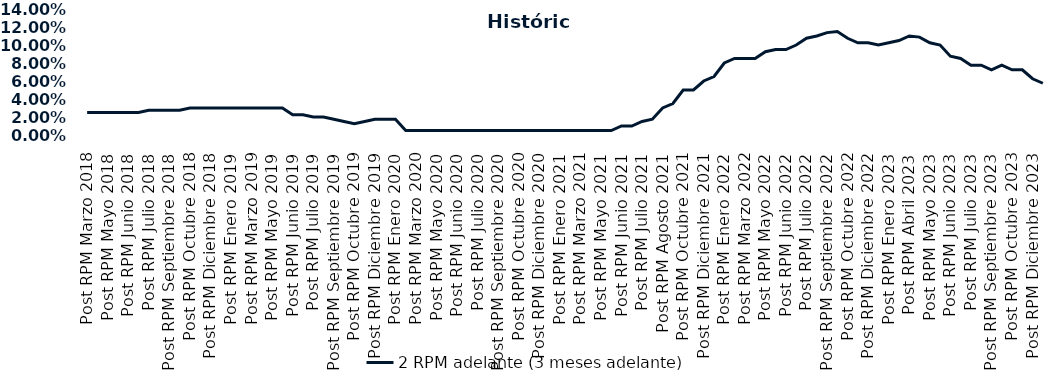
| Category | 2 RPM adelante (3 meses adelante) |
|---|---|
| Post RPM Marzo 2018 | 0.025 |
| Pre RPM Mayo 2018 | 0.025 |
| Post RPM Mayo 2018 | 0.025 |
| Pre RPM Junio 2018 | 0.025 |
| Post RPM Junio 2018 | 0.025 |
| Pre RPM Julio 2018 | 0.025 |
| Post RPM Julio 2018 | 0.028 |
| Pre RPM Septiembre 2018 | 0.028 |
| Post RPM Septiembre 2018 | 0.028 |
| Pre RPM Octubre 2018 | 0.028 |
| Post RPM Octubre 2018 | 0.03 |
| Pre RPM Diciembre 2018 | 0.03 |
| Post RPM Diciembre 2018 | 0.03 |
| Pre RPM Enero 2019 | 0.03 |
| Post RPM Enero 2019 | 0.03 |
| Pre RPM Marzo 2019 | 0.03 |
| Post RPM Marzo 2019 | 0.03 |
| Pre RPM Mayo 2019 | 0.03 |
| Post RPM Mayo 2019 | 0.03 |
| Pre RPM Junio 2019 | 0.03 |
| Post RPM Junio 2019 | 0.022 |
| Pre RPM Julio 2019 | 0.022 |
| Post RPM Julio 2019 | 0.02 |
| Pre RPM Septiembre 2019 | 0.02 |
| Post RPM Septiembre 2019 | 0.018 |
| Pre RPM Octubre 2019 | 0.015 |
| Post RPM Octubre 2019 | 0.012 |
| Pre RPM Diciembre 2019 | 0.015 |
| Post RPM Diciembre 2019 | 0.018 |
| Pre RPM Enero 2020 | 0.018 |
| Post RPM Enero 2020 | 0.018 |
| Pre RPM Marzo 2020 | 0.005 |
| Post RPM Marzo 2020 | 0.005 |
| Pre RPM Mayo 2020 | 0.005 |
| Post RPM Mayo 2020 | 0.005 |
| Pre RPM Junio 2020 | 0.005 |
| Post RPM Junio 2020 | 0.005 |
| Pre RPM Julio 2020 | 0.005 |
| Post RPM Julio 2020 | 0.005 |
| Pre RPM Septiembre 2020 | 0.005 |
| Post RPM Septiembre 2020 | 0.005 |
| Pre RPM Octubre 2020 | 0.005 |
| Post RPM Octubre 2020 | 0.005 |
| Pre RPM Diciembre 2020 | 0.005 |
| Post RPM Diciembre 2020 | 0.005 |
| Pre RPM Enero 2021 | 0.005 |
| Post RPM Enero 2021 | 0.005 |
| Pre RPM Marzo 2021 | 0.005 |
| Post RPM Marzo 2021 | 0.005 |
| Pre RPM Mayo 2021 | 0.005 |
| Post RPM Mayo 2021 | 0.005 |
| Pre RPM Junio 2021 | 0.005 |
| Post RPM Junio 2021 | 0.01 |
| Pre RPM Julio 2021 | 0.01 |
| Post RPM Julio 2021 | 0.015 |
| Pre RPM Agosto 2021 | 0.018 |
| Post RPM Agosto 2021 | 0.03 |
| Pre RPM Octubre 2021 | 0.035 |
| Post RPM Octubre 2021 | 0.05 |
| Pre RPM Diciembre 2021 | 0.05 |
| Post RPM Diciembre 2021 | 0.06 |
| Pre RPM Enero 2022 | 0.065 |
| Post RPM Enero 2022 | 0.08 |
| Pre RPM Marzo 2022 | 0.085 |
| Post RPM Marzo 2022 | 0.085 |
| Pre RPM Mayo 2022 | 0.085 |
| Post RPM Mayo 2022 | 0.092 |
| Pre RPM Junio 2022 | 0.095 |
| Post RPM Junio 2022 | 0.095 |
| Pre RPM Julio 2022 | 0.1 |
| Post RPM Julio 2022 | 0.108 |
| Pre RPM Septiembre 2022 | 0.11 |
| Post RPM Septiembre 2022 | 0.114 |
| Pre RPM Octubre 2022 | 0.115 |
| Post RPM Octubre 2022 | 0.108 |
| Pre RPM Diciembre 2022 | 0.102 |
| Post RPM Diciembre 2022 | 0.102 |
| Pre RPM Enero 2023 | 0.1 |
| Post RPM Enero 2023 | 0.102 |
| Pre RPM Abril 2023 | 0.105 |
| Post RPM Abril 2023 | 0.11 |
| Pre RPM Mayo 2023 | 0.109 |
| Post RPM Mayo 2023 | 0.102 |
| Pre RPM Junio 2023 | 0.1 |
| Post RPM Junio 2023 | 0.088 |
| Pre RPM Julio 2023 | 0.085 |
| Post RPM Julio 2023 | 0.078 |
| Pre RPM Septiembre 2023 | 0.078 |
| Post RPM Septiembre 2023 | 0.072 |
| Pre RPM Octubre 2023 | 0.078 |
| Post RPM Octubre 2023 | 0.072 |
| Pre RPM Diciembre 2023 | 0.072 |
| Post RPM Diciembre 2023 | 0.062 |
| Pre RPM Enero 2024 | 0.058 |